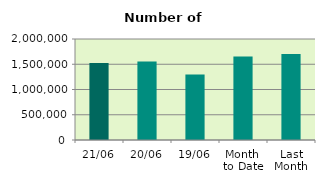
| Category | Series 0 |
|---|---|
| 21/06 | 1524980 |
| 20/06 | 1555124 |
| 19/06 | 1298602 |
| Month 
to Date | 1652415.6 |
| Last
Month | 1704183.545 |